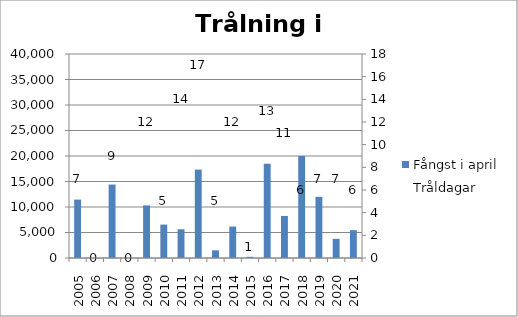
| Category | Fångst i april |
|---|---|
| 2005.0 | 11450 |
| 2006.0 | 0 |
| 2007.0 | 14400 |
| 2008.0 | 0 |
| 2009.0 | 10310 |
| 2010.0 | 6550 |
| 2011.0 | 5630 |
| 2012.0 | 17340 |
| 2013.0 | 1505 |
| 2014.0 | 6164 |
| 2015.0 | 230 |
| 2016.0 | 18486 |
| 2017.0 | 8245 |
| 2018.0 | 20000 |
| 2019.0 | 11995 |
| 2020.0 | 3760 |
| 2021.0 | 5455 |